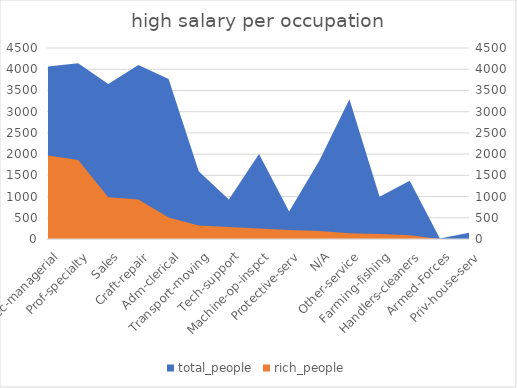
| Category | total_people |
|---|---|
| Exec-managerial | 4066 |
| Prof-specialty | 4140 |
| Sales | 3650 |
| Craft-repair | 4099 |
| Adm-clerical | 3770 |
| Transport-moving | 1597 |
| Tech-support | 928 |
| Machine-op-inspct | 2002 |
| Protective-serv | 649 |
| N/A | 1843 |
| Other-service | 3295 |
| Farming-fishing | 994 |
| Handlers-cleaners | 1370 |
| Armed-Forces | 9 |
| Priv-house-serv | 149 |